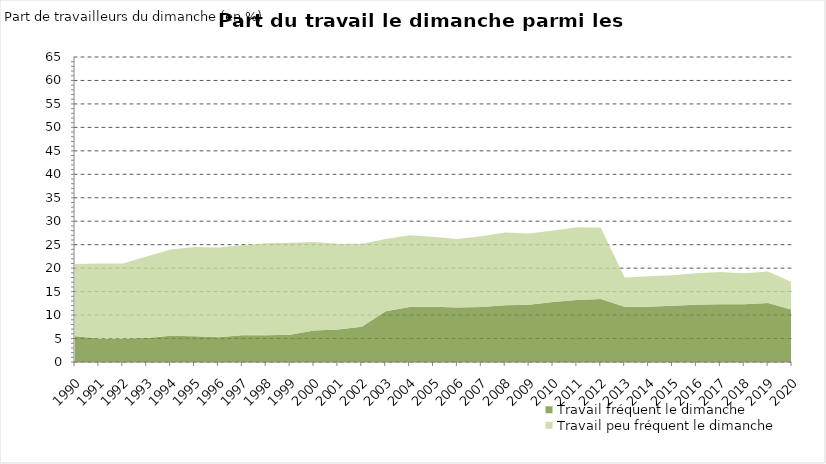
| Category | Travail fréquent le dimanche | Travail peu fréquent le dimanche |
|---|---|---|
| 1990 | 5.5 | 15.4 |
| 1991 | 5 | 16 |
| 1992 | 5 | 16 |
| 1993 | 5.1 | 17.4 |
| 1994 | 5.6 | 18.4 |
| 1995 | 5.5 | 19 |
| 1996 | 5.3 | 19.1 |
| 1997 | 5.7 | 19.2 |
| 1998 | 5.7 | 19.6 |
| 1999 | 5.8 | 19.6 |
| 2000 | 6.7 | 18.9 |
| 2001 | 6.9 | 18.3 |
| 2002 | 7.5 | 17.7 |
| 2003 | 10.8 | 15.4 |
| 2004 | 11.7 | 15.3 |
| 2005 | 11.8 | 14.9 |
| 2006 | 11.6 | 14.6 |
| 2007 | 11.7 | 15.1 |
| 2008 | 12.1 | 15.5 |
| 2009 | 12.2 | 15.2 |
| 2010 | 12.8 | 15.2 |
| 2011 | 13.2 | 15.5 |
| 2012 | 13.4 | 15.2 |
| 2013 | 11.8 | 6.2 |
| 2014 | 11.8 | 6.5 |
| 2015 | 12 | 6.5 |
| 2016 | 12.2 | 6.7 |
| 2017 | 12.3 | 6.9 |
| 2018 | 12.3 | 6.6 |
| 2019 | 12.6 | 6.7 |
| 2020 | 11.1 | 5.9 |